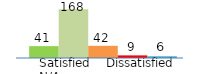
| Category | Series 0 | Series 1 | Series 2 | Series 3 | Series 4 |
|---|---|---|---|---|---|
| 0 | 41 | 168 | 42 | 9 | 6 |